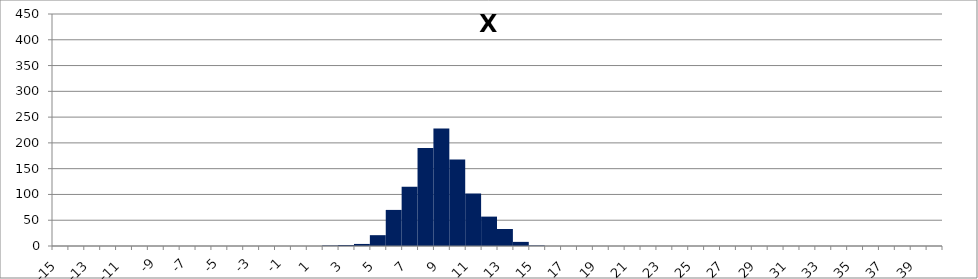
| Category | Freq v x |
|---|---|
| -15.0 | 0 |
| -14.0 | 0 |
| -13.0 | 0 |
| -12.0 | 0 |
| -11.0 | 0 |
| -10.0 | 0 |
| -9.0 | 0 |
| -8.0 | 0 |
| -7.0 | 0 |
| -6.0 | 0 |
| -5.0 | 0 |
| -4.0 | 0 |
| -3.0 | 0 |
| -2.0 | 0 |
| -1.0 | 0 |
| 0.0 | 0 |
| 1.0 | 0 |
| 2.0 | 1 |
| 3.0 | 2 |
| 4.0 | 4 |
| 5.0 | 21 |
| 6.0 | 70 |
| 7.0 | 115 |
| 8.0 | 190 |
| 9.0 | 228 |
| 10.0 | 168 |
| 11.0 | 102 |
| 12.0 | 57 |
| 13.0 | 33 |
| 14.0 | 8 |
| 15.0 | 1 |
| 16.0 | 0 |
| 17.0 | 0 |
| 18.0 | 0 |
| 19.0 | 0 |
| 20.0 | 0 |
| 21.0 | 0 |
| 22.0 | 0 |
| 23.0 | 0 |
| 24.0 | 0 |
| 25.0 | 0 |
| 26.0 | 0 |
| 27.0 | 0 |
| 28.0 | 0 |
| 29.0 | 0 |
| 30.0 | 0 |
| 31.0 | 0 |
| 32.0 | 0 |
| 33.0 | 0 |
| 34.0 | 0 |
| 35.0 | 0 |
| 36.0 | 0 |
| 37.0 | 0 |
| 38.0 | 0 |
| 39.0 | 0 |
| 40.0 | 0 |